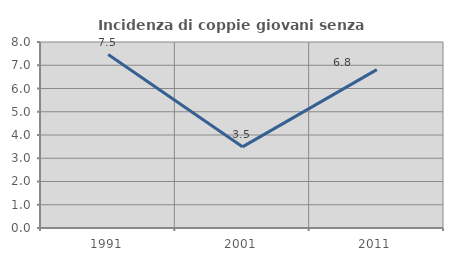
| Category | Incidenza di coppie giovani senza figli |
|---|---|
| 1991.0 | 7.459 |
| 2001.0 | 3.491 |
| 2011.0 | 6.814 |